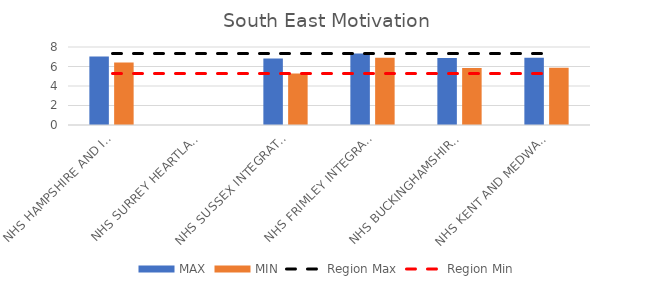
| Category | MAX | MIN |
|---|---|---|
| NHS HAMPSHIRE AND ISLE OF WIGHT INTEGRATED CARE BOARD | 7.038 | 6.412 |
| NHS SURREY HEARTLANDS INTEGRATED CARE BOARD | 0 | 0 |
| NHS SUSSEX INTEGRATED CARE BOARD | 6.812 | 5.281 |
| NHS FRIMLEY INTEGRATED CARE BOARD | 7.327 | 6.885 |
| NHS BUCKINGHAMSHIRE, OXFORDSHIRE AND BERKSHIRE WEST INTEGRATED CARE BOARD | 6.868 | 5.854 |
| NHS KENT AND MEDWAY INTEGRATED CARE BOARD | 6.905 | 5.877 |